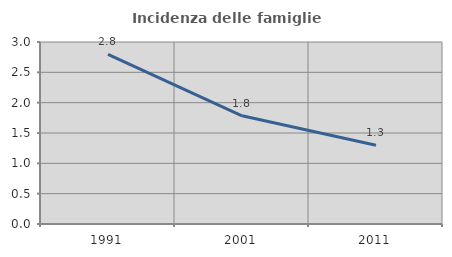
| Category | Incidenza delle famiglie numerose |
|---|---|
| 1991.0 | 2.794 |
| 2001.0 | 1.783 |
| 2011.0 | 1.297 |